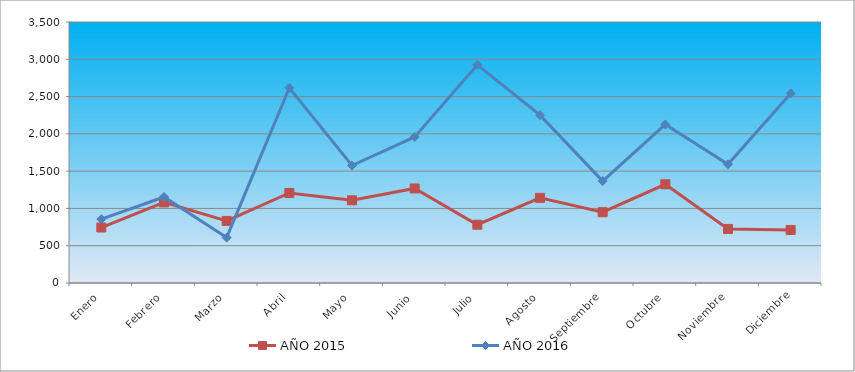
| Category | AÑO 2015 | AÑO 2016 |
|---|---|---|
| Enero | 743.921 | 856.842 |
| Febrero | 1080.791 | 1153.625 |
| Marzo | 832.818 | 608.565 |
| Abril | 1207.118 | 2617.663 |
| Mayo | 1108.864 | 1575.6 |
| Junio | 1267.941 | 1959.079 |
| Julio | 781.351 | 2926.114 |
| Agosto | 1141.615 | 2250.857 |
| Septiembre | 949.786 | 1367.187 |
| Octubre | 1324.086 | 2125.809 |
| Noviembre | 725.206 | 1592.273 |
| Diciembre | 711.17 | 2542.634 |